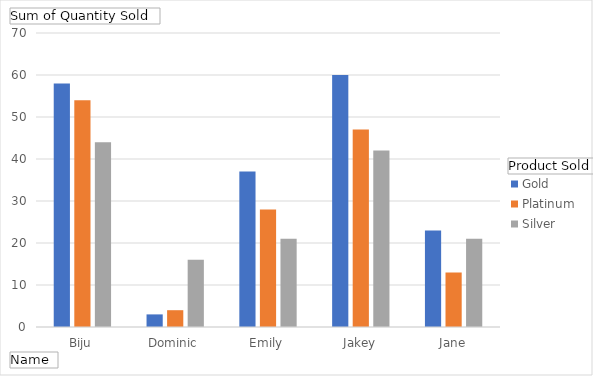
| Category | Gold | Platinum | Silver |
|---|---|---|---|
| Biju | 58 | 54 | 44 |
| Dominic | 3 | 4 | 16 |
| Emily | 37 | 28 | 21 |
| Jakey | 60 | 47 | 42 |
| Jane | 23 | 13 | 21 |